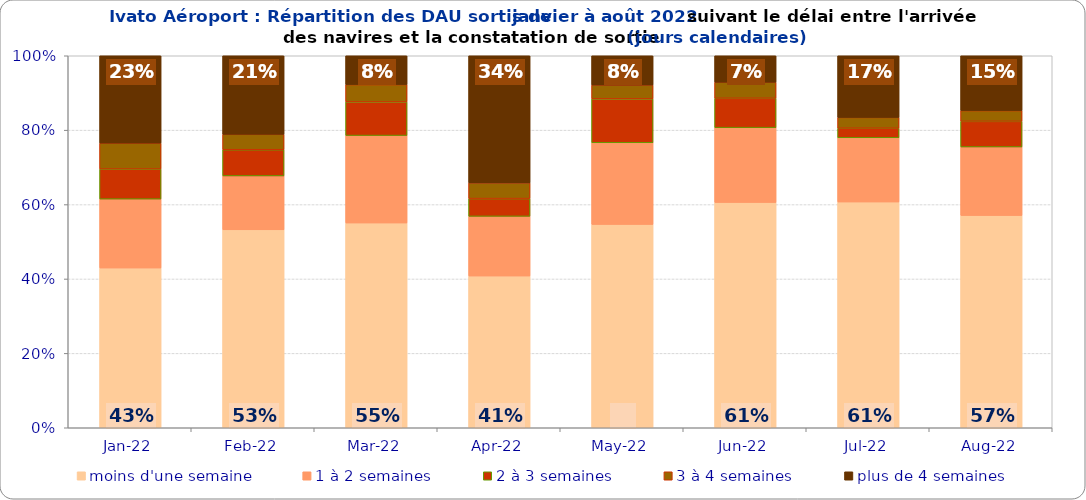
| Category | moins d'une semaine | 1 à 2 semaines | 2 à 3 semaines | 3 à 4 semaines | plus de 4 semaines |
|---|---|---|---|---|---|
| 2022-01-01 | 0.429 | 0.185 | 0.081 | 0.07 | 0.235 |
| 2022-02-01 | 0.532 | 0.145 | 0.07 | 0.041 | 0.211 |
| 2022-03-01 | 0.55 | 0.235 | 0.09 | 0.047 | 0.078 |
| 2022-04-01 | 0.408 | 0.16 | 0.048 | 0.042 | 0.342 |
| 2022-05-01 | 0.547 | 0.219 | 0.118 | 0.037 | 0.079 |
| 2022-06-01 | 0.606 | 0.201 | 0.079 | 0.043 | 0.071 |
| 2022-07-01 | 0.607 | 0.173 | 0.026 | 0.029 | 0.166 |
| 2022-08-01 | 0.571 | 0.184 | 0.069 | 0.029 | 0.147 |